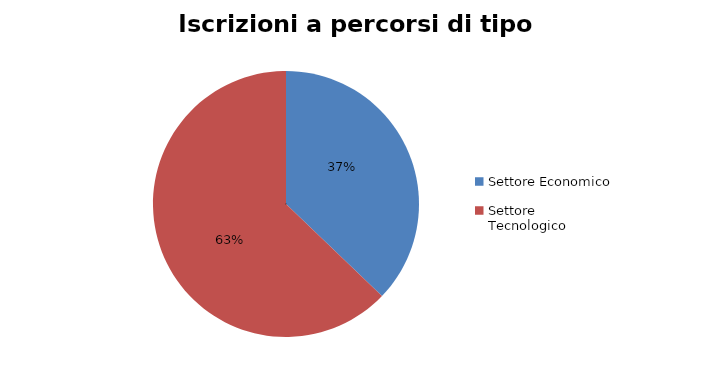
| Category | Series 0 |
|---|---|
| Settore Economico | 5223 |
| Settore Tecnologico | 8829 |